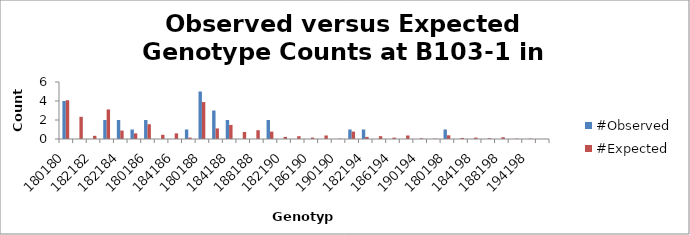
| Category | #Observed | #Expected |
|---|---|---|
| 180180.0 | 4 | 4.083 |
| 180182.0 | 0 | 2.333 |
| 182182.0 | 0 | 0.333 |
| 180184.0 | 2 | 3.111 |
| 182184.0 | 2 | 0.889 |
| 184184.0 | 1 | 0.593 |
| 180186.0 | 2 | 1.556 |
| 182186.0 | 0 | 0.444 |
| 184186.0 | 0 | 0.593 |
| 186186.0 | 1 | 0.148 |
| 180188.0 | 5 | 3.889 |
| 182188.0 | 3 | 1.111 |
| 184188.0 | 2 | 1.481 |
| 186188.0 | 0 | 0.741 |
| 188188.0 | 0 | 0.926 |
| 180190.0 | 2 | 0.778 |
| 182190.0 | 0 | 0.222 |
| 184190.0 | 0 | 0.296 |
| 186190.0 | 0 | 0.148 |
| 188190.0 | 0 | 0.37 |
| 190190.0 | 0 | 0.037 |
| 180194.0 | 1 | 0.778 |
| 182194.0 | 1 | 0.222 |
| 184194.0 | 0 | 0.296 |
| 186194.0 | 0 | 0.148 |
| 188194.0 | 0 | 0.37 |
| 190194.0 | 0 | 0.074 |
| 194194.0 | 0 | 0.037 |
| 180198.0 | 1 | 0.389 |
| 182198.0 | 0 | 0.111 |
| 184198.0 | 0 | 0.148 |
| 186198.0 | 0 | 0.074 |
| 188198.0 | 0 | 0.185 |
| 190198.0 | 0 | 0.037 |
| 194198.0 | 0 | 0.037 |
| 198198.0 | 0 | 0.009 |